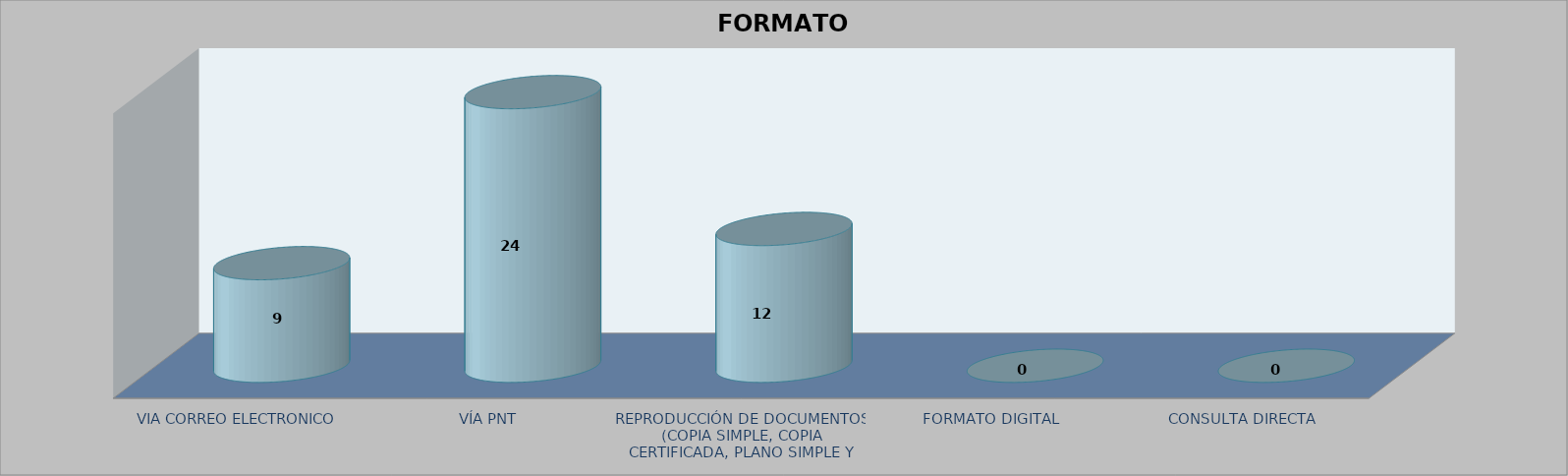
| Category |        FORMATO SOLICITADO | Series 1 | Series 2 |
|---|---|---|---|
| VIA CORREO ELECTRONICO |  |  | 9 |
| VÍA PNT |  |  | 24 |
| REPRODUCCIÓN DE DOCUMENTOS (COPIA SIMPLE, COPIA CERTIFICADA, PLANO SIMPLE Y PLANO CERTIFICADO) |  |  | 12 |
| FORMATO DIGITAL |  |  | 0 |
| CONSULTA DIRECTA |  |  | 0 |